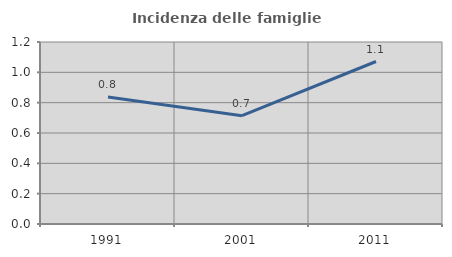
| Category | Incidenza delle famiglie numerose |
|---|---|
| 1991.0 | 0.837 |
| 2001.0 | 0.714 |
| 2011.0 | 1.071 |